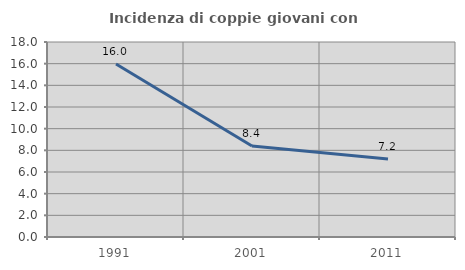
| Category | Incidenza di coppie giovani con figli |
|---|---|
| 1991.0 | 15.974 |
| 2001.0 | 8.394 |
| 2011.0 | 7.203 |